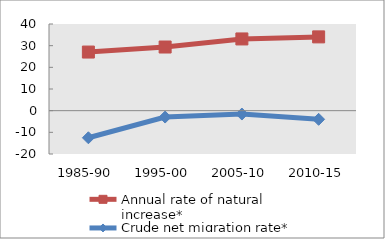
| Category | Annual rate of natural increase* | Crude net migration rate* |
|---|---|---|
| 1985-90 | 27.054 | -12.509 |
| 1995-00 | 29.376 | -2.95 |
| 2005-10 | 33.101 | -1.555 |
| 2010-15 | 34.056 | -4 |